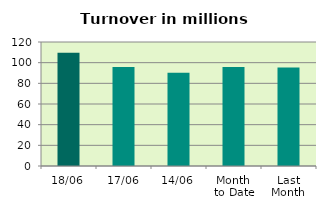
| Category | Series 0 |
|---|---|
| 18/06 | 109.69 |
| 17/06 | 95.791 |
| 14/06 | 90.273 |
| Month 
to Date | 95.849 |
| Last
Month | 95.269 |